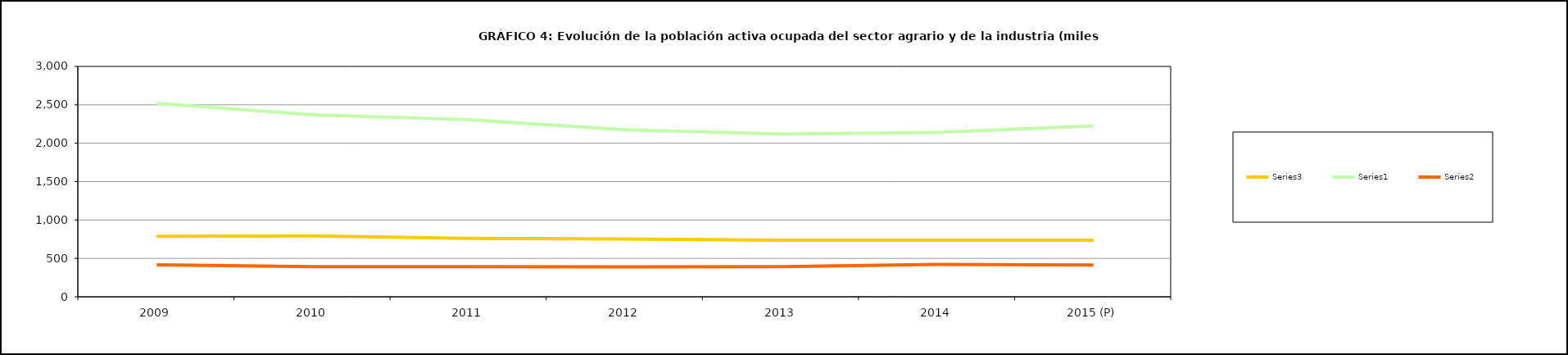
| Category | Series 3 | Series 0 | Series 1 |
|---|---|---|---|
| 2009 | 786.05 | 2519.475 | 415.6 |
| 2010 | 792.975 | 2370.1 | 392.275 |
| 2011 | 760.15 | 2304.9 | 393.05 |
| 2012 | 753.225 | 2175.575 | 388.925 |
| 2013 | 736.6 | 2118.7 | 393.3 |
| 2014 | 735.85 | 2141.4 | 420.65 |
| 2015 (P) | 736.75 | 2225.025 | 414.025 |